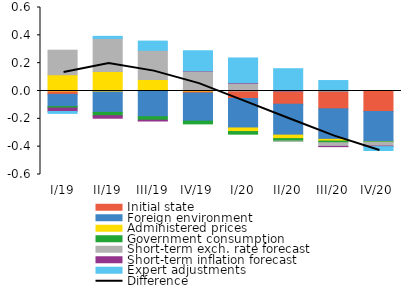
| Category | Initial state | Foreign environment | Administered prices | Government consumption | Short-term exch. rate forecast  | Short-term inflation forecast  | Expert adjustments |
|---|---|---|---|---|---|---|---|
| I/19 | -0.024 | -0.088 | 0.117 | -0.011 | 0.177 | -0.024 | -0.014 |
| II/19 | -0.005 | -0.149 | 0.139 | -0.024 | 0.238 | -0.018 | 0.015 |
| III/19 | 0.006 | -0.185 | 0.077 | -0.025 | 0.209 | -0.006 | 0.066 |
| IV/19 | -0.014 | -0.202 | 0.009 | -0.02 | 0.135 | 0.002 | 0.144 |
| I/20 | -0.054 | -0.212 | -0.026 | -0.019 | 0.056 | 0.004 | 0.178 |
| II/20 | -0.096 | -0.221 | -0.025 | -0.017 | 0 | 0.002 | 0.159 |
| III/20 | -0.128 | -0.219 | -0.012 | -0.012 | -0.026 | -0.002 | 0.075 |
| IV/20 | -0.147 | -0.216 | -0.001 | -0.003 | -0.028 | -0.004 | -0.028 |